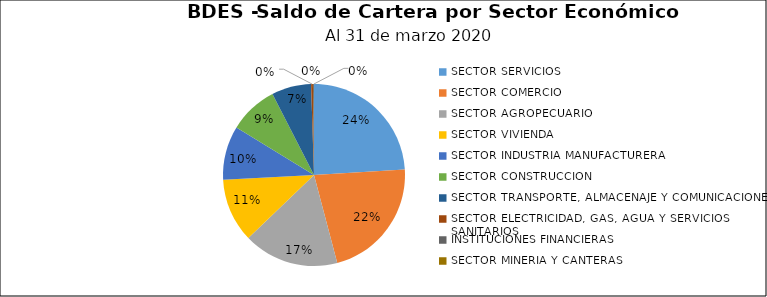
| Category | Saldo | Créditos |
|---|---|---|
| SECTOR SERVICIOS | 92.358 | 3718 |
| SECTOR COMERCIO | 83.815 | 7394 |
| SECTOR AGROPECUARIO | 65.015 | 2054 |
| SECTOR VIVIENDA | 43.582 | 2488 |
| SECTOR INDUSTRIA MANUFACTURERA | 36.82 | 576 |
| SECTOR CONSTRUCCION | 33.375 | 2293 |
| SECTOR TRANSPORTE, ALMACENAJE Y COMUNICACIONES | 27.007 | 1298 |
| SECTOR ELECTRICIDAD, GAS, AGUA Y SERVICIOS SANITARIOS | 1.247 | 10 |
| INSTITUCIONES FINANCIERAS | 0.622 | 3 |
| SECTOR MINERIA Y CANTERAS | 0.096 | 8 |